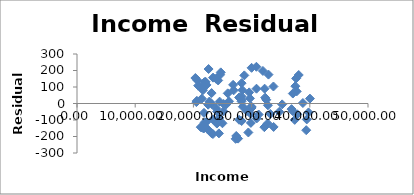
| Category | Series 0 |
|---|---|
| 30000.0 | -26.822 |
| 32329.0 | 35.536 |
| 32525.0 | 22.689 |
| 32805.0 | -10.774 |
| 31214.0 | -66.603 |
| 28287.0 | 42.516 |
| 26123.0 | 13.306 |
| 23182.0 | -4.194 |
| 25197.0 | -2.919 |
| 28487.0 | -19.485 |
| 29977.0 | -21.131 |
| 29955.0 | -17.834 |
| 33213.0 | -63.297 |
| 36864.0 | -34.105 |
| 34751.0 | -50.303 |
| 37854.0 | -65.529 |
| 37518.0 | 104.986 |
| 37409.0 | -99.298 |
| 39784.0 | -54.05 |
| 40023.0 | 29.62 |
| 38812.0 | 2.827 |
| 37749.0 | 73.389 |
| 37655.0 | 152.029 |
| 39480.0 | -96.508 |
| 39383.0 | -161.782 |
| 38100.0 | 172.742 |
| 37083.0 | -46.358 |
| 37085.0 | 60.406 |
| 35251.0 | -5.257 |
| 32757.0 | -120.864 |
| 33756.0 | 103.102 |
| 32192.0 | -143.401 |
| 29714.0 | 31.15 |
| 27852.0 | -98.709 |
| 26824.0 | 113.064 |
| 29838.0 | -61.923 |
| 30844.0 | 89.59 |
| 33784.0 | -142.091 |
| 30905.0 | -90.002 |
| 29876.0 | -117.488 |
| 29583.0 | 67.515 |
| 28306.0 | 21.503 |
| 25572.0 | -7.994 |
| 25159.0 | -47.759 |
| 24255.0 | 139.754 |
| 21937.0 | -114.3 |
| 21447.0 | 29.802 |
| 24443.0 | -86.852 |
| 23376.0 | 156.651 |
| 23914.0 | 149.705 |
| 22095.0 | 131.379 |
| 20338.0 | 154.459 |
| 20821.0 | 108.294 |
| 24596.0 | 174.282 |
| 24091.0 | -48.963 |
| 21263.0 | -143.309 |
| 20511.0 | 8.409 |
| 21823.0 | -56.545 |
| 21741.0 | -151.488 |
| 23959.0 | -30.48 |
| 25901.0 | 61.637 |
| 23357.0 | -184.928 |
| 24038.0 | -121.607 |
| 22757.0 | 12.04 |
| 20680.0 | 140.934 |
| 23158.0 | -181.203 |
| 20593.0 | 16.089 |
| 21442.0 | -144.321 |
| 22251.0 | 112.594 |
| 21899.0 | 129.778 |
| 21402.0 | 93.743 |
| 23129.0 | 63.192 |
| 22608.0 | 208.996 |
| 24704.0 | 188.641 |
| 28399.0 | 81.282 |
| 32241.0 | 89.941 |
| 29442.0 | -175.506 |
| 28749.0 | 170.413 |
| 26915.0 | 79.745 |
| 28273.0 | 12.768 |
| 27362.0 | -196.857 |
| 30001.0 | 216.19 |
| 28283.0 | 123.235 |
| 27684.0 | -212.84 |
| 28291.0 | -106.175 |
| 31948.0 | 197.333 |
| 32899.0 | 175.161 |
| 30826.0 | 222.544 |
| 29183.0 | -46.02 |
| 27851.0 | 36.399 |
| 27257.0 | -214.203 |
| 24506.0 | 11.323 |
| 23352.0 | -96.241 |
| 21642.0 | 80.52 |
| 22538.0 | -7.11 |
| 24383.0 | -181.12 |
| 21852.0 | -147.805 |
| 22225.0 | -111.693 |
| 22487.0 | -157.277 |
| 24992.0 | -119.873 |